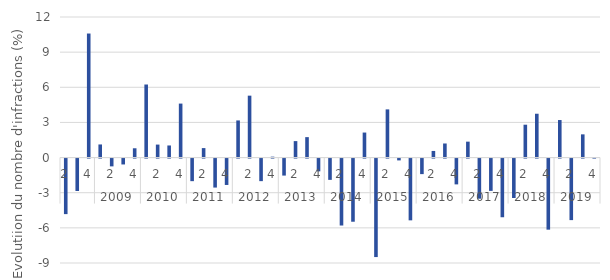
| Category | évolution trimestrielle (%) |
|---|---|
| 0 | -4.742 |
| 1 | -2.766 |
| 2 | 10.59 |
| 3 | 1.12 |
| 4 | -0.666 |
| 5 | -0.502 |
| 6 | 0.794 |
| 7 | 6.237 |
| 8 | 1.108 |
| 9 | 1.033 |
| 10 | 4.608 |
| 11 | -1.928 |
| 12 | 0.809 |
| 13 | -2.476 |
| 14 | -2.253 |
| 15 | 3.17 |
| 16 | 5.286 |
| 17 | -1.927 |
| 18 | 0.077 |
| 19 | -1.452 |
| 20 | 1.406 |
| 21 | 1.745 |
| 22 | -1.09 |
| 23 | -1.818 |
| 24 | -5.715 |
| 25 | -5.392 |
| 26 | 2.136 |
| 27 | -8.408 |
| 28 | 4.113 |
| 29 | -0.156 |
| 30 | -5.273 |
| 31 | -1.327 |
| 32 | 0.565 |
| 33 | 1.202 |
| 34 | -2.203 |
| 35 | 1.359 |
| 36 | -3.425 |
| 37 | -2.759 |
| 38 | -5.009 |
| 39 | -3.368 |
| 40 | 2.806 |
| 41 | 3.742 |
| 42 | -6.069 |
| 43 | 3.205 |
| 44 | -5.253 |
| 45 | 1.982 |
| 46 | 0.051 |